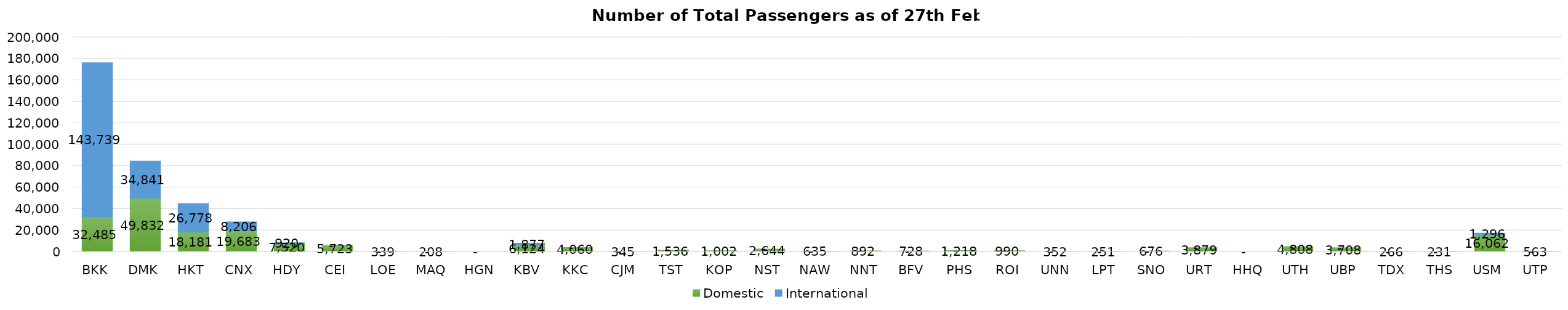
| Category | Domestic | International |
|---|---|---|
| BKK | 32485 | 143739 |
| DMK | 49832 | 34841 |
| HKT | 18181 | 26778 |
| CNX | 19683 | 8206 |
| HDY | 7520 | 920 |
| CEI | 5723 | 0 |
| LOE | 339 | 0 |
| MAQ | 208 | 0 |
| HGN | 0 | 0 |
| KBV | 6124 | 1877 |
| KKC | 4060 | 0 |
| CJM | 345 | 0 |
| TST | 1536 | 0 |
| KOP | 1002 | 0 |
| NST | 2644 | 0 |
| NAW | 635 | 0 |
| NNT | 892 | 0 |
| BFV | 728 | 0 |
| PHS | 1218 | 0 |
| ROI | 990 | 0 |
| UNN | 352 | 0 |
| LPT | 251 | 0 |
| SNO | 676 | 0 |
| URT | 3879 | 0 |
| HHQ | 0 | 0 |
| UTH | 4808 | 0 |
| UBP | 3708 | 0 |
| TDX | 266 | 0 |
| THS | 231 | 0 |
| USM | 16062 | 1296 |
| UTP | 563 | 0 |